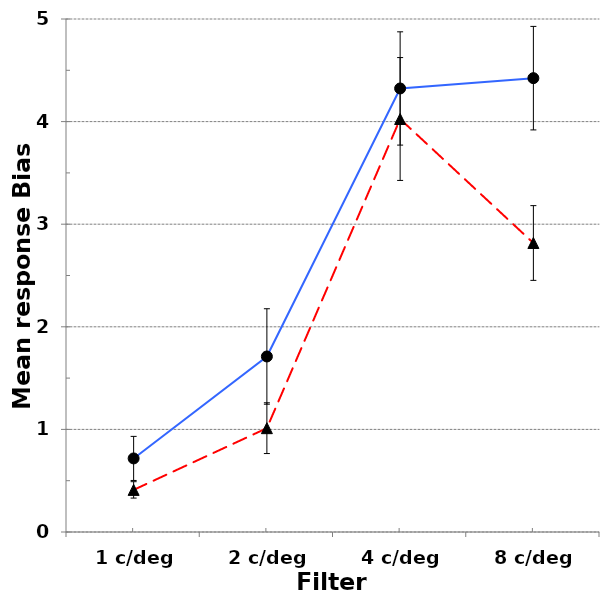
| Category | Low Unusual Experiences score | High Unusual Experiences score | Series 2 |
|---|---|---|---|
| 1 c/deg | 0.717 | 0.41 |  |
| 2 c/deg | 1.711 | 1.012 |  |
| 4 c/deg | 4.323 | 4.025 |  |
| 8 c/deg | 4.423 | 2.817 |  |